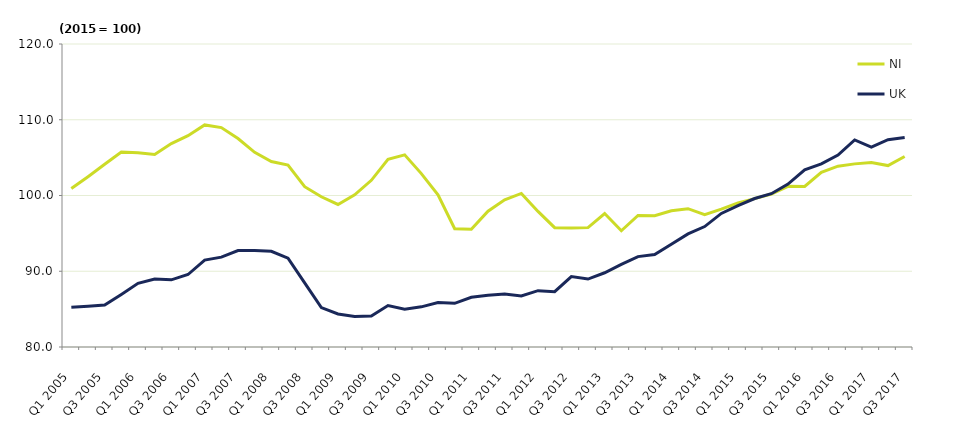
| Category | NI  | UK  |
|---|---|---|
| Q1 2005 | 100.915 | 85.233 |
| Q2 2005 | 102.483 | 85.367 |
| Q3 2005 | 104.125 | 85.533 |
| Q4 2005 | 105.736 | 86.933 |
| Q1 2006 | 105.654 | 88.4 |
| Q2 2006 | 105.406 | 88.967 |
| Q3 2006 | 106.851 | 88.867 |
| Q4 2006 | 107.899 | 89.567 |
| Q1 2007 | 109.318 | 91.467 |
| Q2 2007 | 108.964 | 91.867 |
| Q3 2007 | 107.525 | 92.733 |
| Q4 2007 | 105.702 | 92.733 |
| Q1 2008 | 104.477 | 92.633 |
| Q2 2008 | 104.027 | 91.733 |
| Q3 2008 | 101.167 | 88.467 |
| Q4 2008 | 99.83 | 85.2 |
| Q1 2009 | 98.82 | 84.367 |
| Q2 2009 | 100.082 | 84.033 |
| Q3 2009 | 102.003 | 84.1 |
| Q4 2009 | 104.769 | 85.467 |
| Q1 2010 | 105.363 | 85 |
| Q2 2010 | 102.89 | 85.3 |
| Q3 2010 | 100.093 | 85.867 |
| Q4 2010 | 95.62 | 85.767 |
| Q1 2011 | 95.555 | 86.567 |
| Q2 2011 | 97.93 | 86.833 |
| Q3 2011 | 99.443 | 87 |
| Q4 2011 | 100.277 | 86.733 |
| Q1 2012 | 97.9 | 87.433 |
| Q2 2012 | 95.756 | 87.3 |
| Q3 2012 | 95.704 | 89.3 |
| Q4 2012 | 95.759 | 88.967 |
| Q1 2013 | 97.614 | 89.8 |
| Q2 2013 | 95.349 | 90.9 |
| Q3 2013 | 97.366 | 91.933 |
| Q4 2013 | 97.335 | 92.2 |
| Q1 2014 | 97.981 | 93.567 |
| Q2 2014 | 98.258 | 94.933 |
| Q3 2014 | 97.481 | 95.9 |
| Q4 2014 | 98.191 | 97.633 |
| Q1 2015 | 99.004 | 98.667 |
| Q2 2015 | 99.591 | 99.6 |
| Q3 2015 | 100.196 | 100.233 |
| Q4 2015 | 101.209 | 101.5 |
| Q1 2016 | 101.198 | 103.4 |
| Q2 2016 | 103.047 | 104.167 |
| Q3 2016 | 103.872 | 105.333 |
| Q4 2016 | 104.175 | 107.333 |
| Q1 2017 | 104.341 | 106.4 |
| Q2 2017 | 103.948 | 107.367 |
| Q3 2017 | 105.143 | 107.667 |